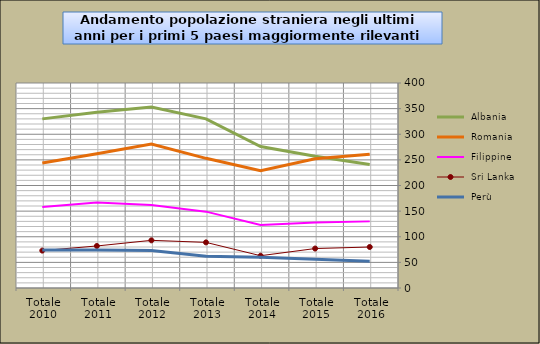
| Category |  Albania  |  Romania  |  Filippine  |  Sri Lanka  |  Perù  |
|---|---|---|---|---|---|
| Totale 2016 | 241 | 261 | 130 | 80 | 52 |
| Totale 2015 | 257 | 252 | 128 | 77 | 56 |
| Totale 2014 | 276 | 229 | 123 | 63 | 60 |
| Totale 2013 | 330 | 253 | 149 | 89 | 62 |
| Totale 2012 | 353 | 281 | 162 | 93 | 73 |
| Totale 2011 | 343 | 262 | 167 | 82 | 74 |
| Totale 2010 | 330 | 244 | 158 | 73 | 74 |